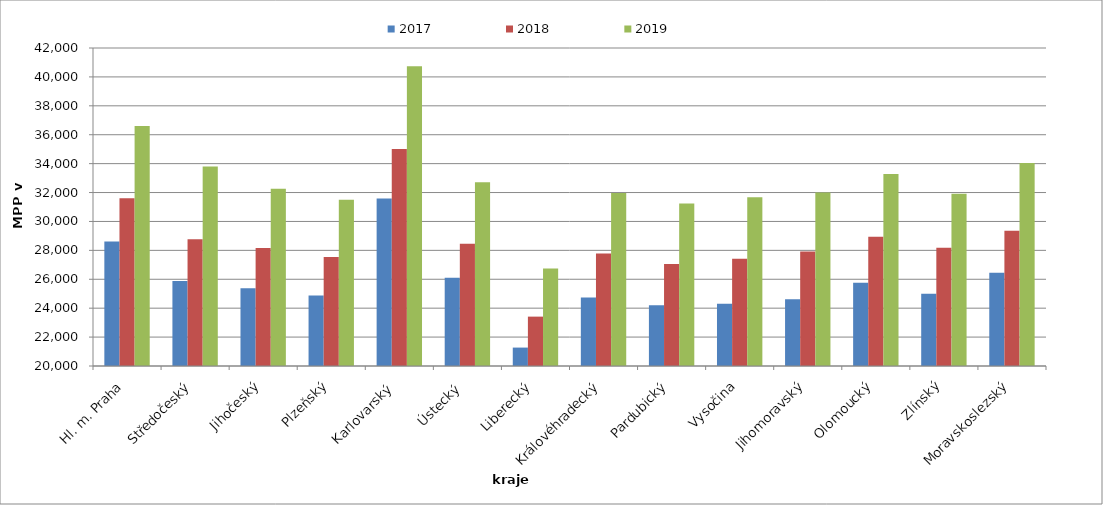
| Category | 2017 | 2018 | 2019 |
|---|---|---|---|
| Hl. m. Praha | 28620.357 | 31600.087 | 36606.781 |
| Středočeský | 25887.927 | 28766.531 | 33794.178 |
| Jihočeský | 25377.881 | 28169.843 | 32254.084 |
| Plzeňský | 24884.08 | 27547.071 | 31509.304 |
| Karlovarský  | 31596.33 | 35009.174 | 40733.945 |
| Ústecký   | 26102.283 | 28451.142 | 32718.721 |
| Liberecký | 21274.302 | 23415.92 | 26739.818 |
| Královéhradecký | 24742.779 | 27791.472 | 31960.11 |
| Pardubický | 24210.108 | 27064.62 | 31243.293 |
| Vysočina | 24306.483 | 27417.655 | 31667.773 |
| Jihomoravský | 24609.972 | 27929.086 | 32011.08 |
| Olomoucký | 25766.191 | 28935.234 | 33275.764 |
| Zlínský | 24991.095 | 28187.965 | 31922.447 |
| Moravskoslezský | 26456.807 | 29356.766 | 34051.127 |